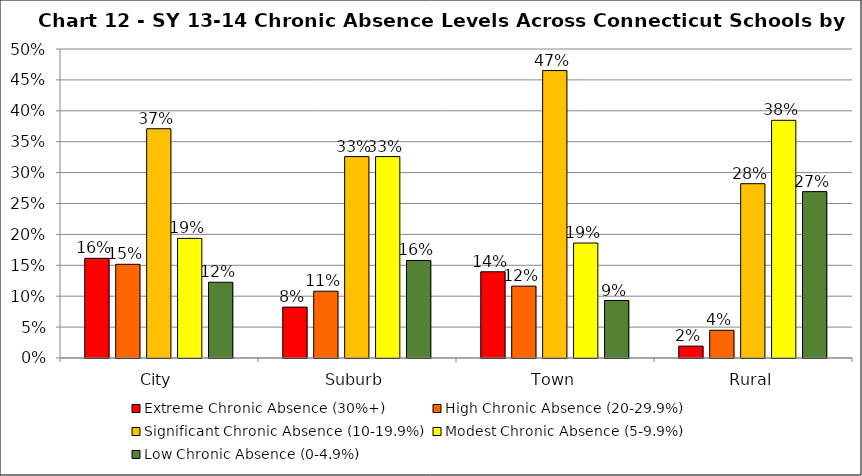
| Category | Extreme Chronic Absence (30%+) | High Chronic Absence (20-29.9%) | Significant Chronic Absence (10-19.9%) | Modest Chronic Absence (5-9.9%) | Low Chronic Absence (0-4.9%) |
|---|---|---|---|---|---|
| 0 | 0.161 | 0.152 | 0.371 | 0.194 | 0.123 |
| 1 | 0.082 | 0.108 | 0.326 | 0.326 | 0.158 |
| 2 | 0.14 | 0.116 | 0.465 | 0.186 | 0.093 |
| 3 | 0.019 | 0.045 | 0.282 | 0.385 | 0.269 |